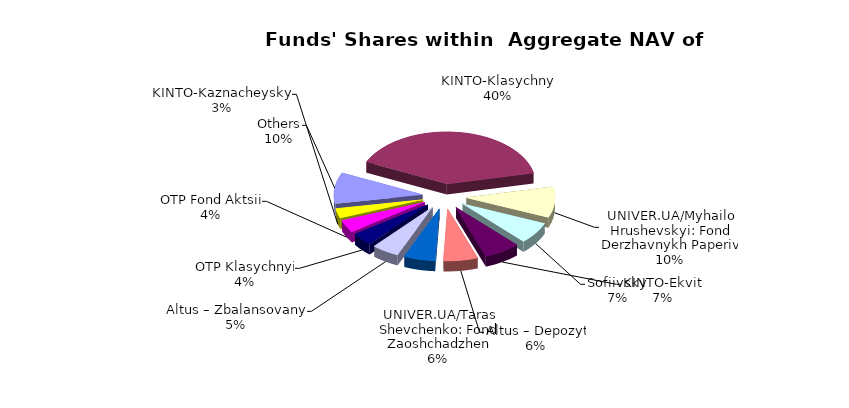
| Category | Series 0 | Series 1 |
|---|---|---|
| Others | 5186465.71 | 0.094 |
| KINTO-Klasychnyi | 21323612.53 | 0.387 |
| UNIVER.UA/Myhailo Hrushevskyi: Fond Derzhavnykh Paperiv | 5141934.41 | 0.093 |
| Sofiivskyi | 3620739.392 | 0.066 |
| KINTO-Ekviti | 3535328.82 | 0.064 |
| Altus – Depozyt | 3345243.67 | 0.061 |
| UNIVER.UA/Taras Shevchenko: Fond Zaoshchadzhen | 3073512.86 | 0.056 |
| Altus – Zbalansovanyi | 2656753.31 | 0.048 |
| ОТP Klasychnyi | 2131927.87 | 0.039 |
| OTP Fond Aktsii | 2045179.04 | 0.037 |
| KINTO-Kaznacheyskyi | 1620693.6 | 0.029 |